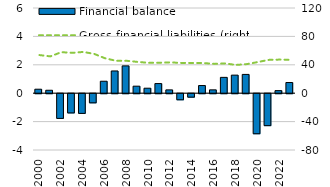
| Category | Financial balance |
|---|---|
| 2000.0 | 0.281 |
| 2001.0 | 0.207 |
| 2002.0 | -1.74 |
| 2003.0 | -1.354 |
| 2004.0 | -1.387 |
| 2005.0 | -0.643 |
| 2006.0 | 0.842 |
| 2007.0 | 1.566 |
| 2008.0 | 1.924 |
| 2009.0 | 0.494 |
| 2010.0 | 0.352 |
| 2011.0 | 0.678 |
| 2012.0 | 0.233 |
| 2013.0 | -0.428 |
| 2014.0 | -0.244 |
| 2015.0 | 0.539 |
| 2016.0 | 0.236 |
| 2017.0 | 1.115 |
| 2018.0 | 1.272 |
| 2019.0 | 1.323 |
| 2020.0 | -2.821 |
| 2021.0 | -2.25 |
| 2022.0 | 0.181 |
| 2023.0 | 0.752 |